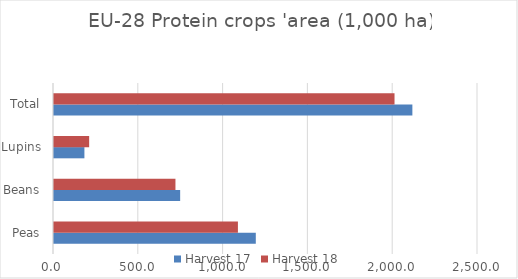
| Category | Harvest 17 | Harvest 18 |
|---|---|---|
| Peas | 1189.9 | 1084.4 |
| Beans | 743.85 | 716.096 |
| Lupins | 179.3 | 207.3 |
| Total | 2113.05 | 2007.796 |